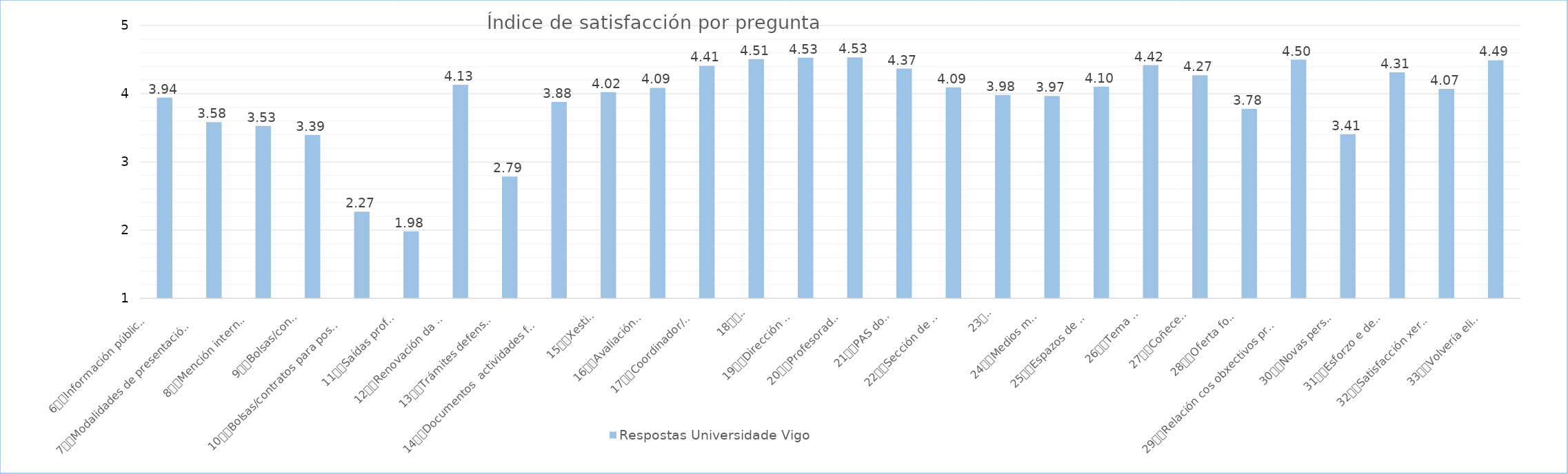
| Category | Respostas Universidade Vigo |
|---|---|
| 6
Información pública DO pd | 3.941 |
| 7
Modalidades de presentación da tese | 3.584 |
| 8
Mención internacional | 3.528 |
| 9
Bolsas/contratos | 3.394 |
| 10
Bolsas/contratos para postdoutorais | 2.27 |
| 11
Saídas profesionais | 1.983 |
| 12
Renovación da matrícula | 4.131 |
| 13
Trámites defensa da tese | 2.785 |
| 14
Documentos  actividades formativas | 3.878 |
| 15
Xestión do PI | 4.024 |
| 16
Avaliacións anuais | 4.086 |
| 17
Coordinador/a do PD | 4.409 |
| 18
Titor/a | 4.508 |
| 19
Dirección da tese | 4.528 |
| 20
Profesorado do PD | 4.534 |
| 21
PAS do centro | 4.368 |
| 22
Sección de Posgrao | 4.094 |
| 23
EIDO | 3.98 |
| 24
Medios materiais | 3.966 |
| 25
Espazos de traballo | 4.104 |
| 26
Tema da tese | 4.418 |
| 27
Coñecementos | 4.27 |
| 28
Oferta formativa | 3.779 |
| 29
Relación cos obxectivos profesionais | 4.5 |
| 30
Novas perspectivas | 3.408 |
| 31
Esforzo e dedicación | 4.314 |
| 32
Satisfacción xeral co PD | 4.07 |
| 33
Volvería elixir o PD | 4.491 |